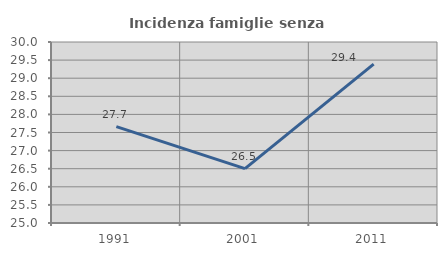
| Category | Incidenza famiglie senza nuclei |
|---|---|
| 1991.0 | 27.664 |
| 2001.0 | 26.504 |
| 2011.0 | 29.391 |